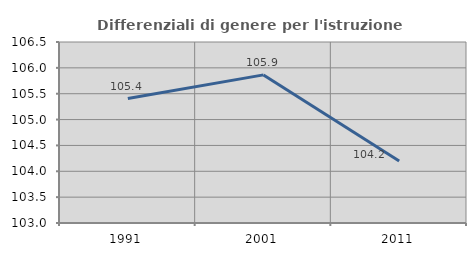
| Category | Differenziali di genere per l'istruzione superiore |
|---|---|
| 1991.0 | 105.407 |
| 2001.0 | 105.864 |
| 2011.0 | 104.197 |